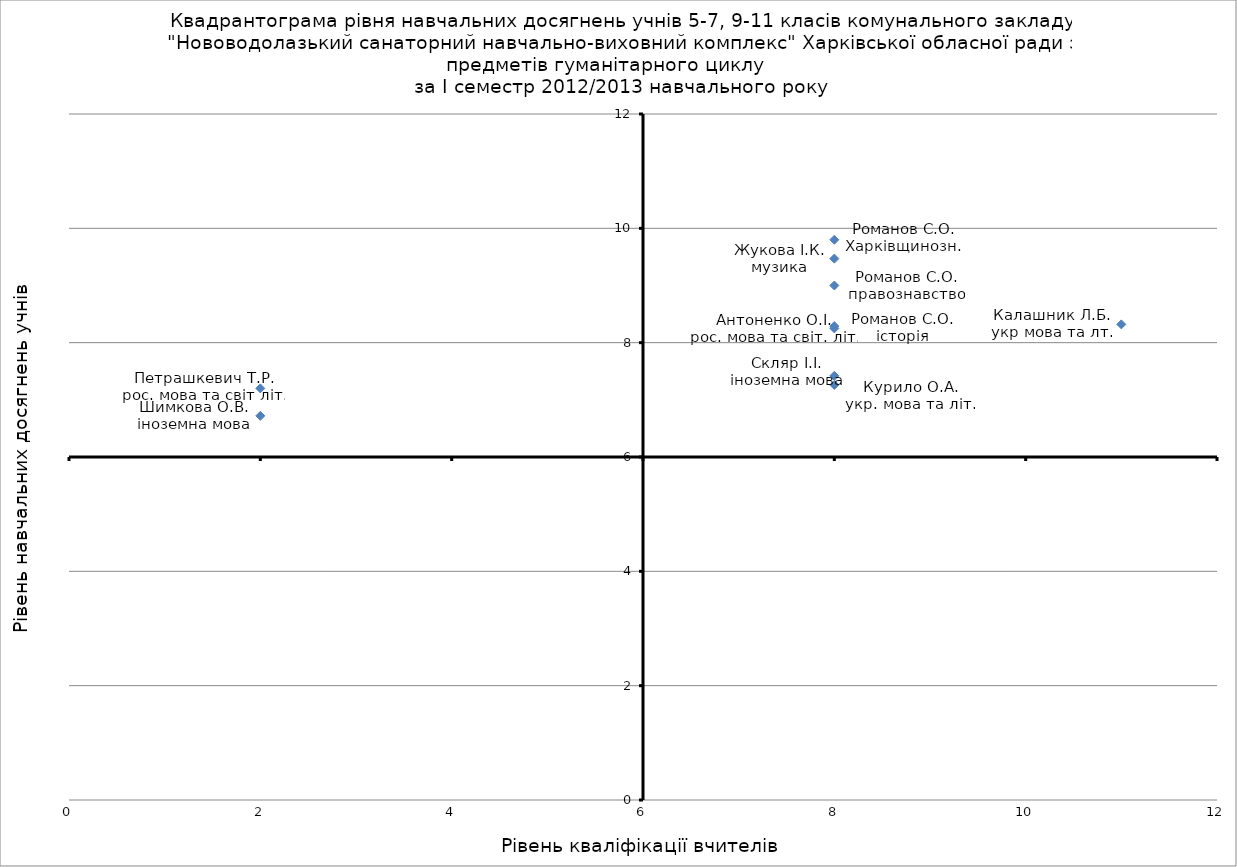
| Category | Series 0 |
|---|---|
| 11.0 | 8.32 |
| 8.0 | 7.26 |
| 2.0 | 7.2 |
| 8.0 | 7.42 |
| 8.0 | 8.25 |
| 8.0 | 9.47 |
| 2.0 | 6.72 |
| 8.0 | 8.29 |
| 8.0 | 9 |
| 8.0 | 9.8 |